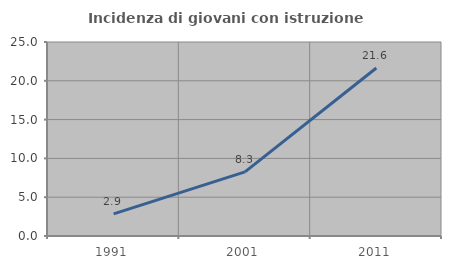
| Category | Incidenza di giovani con istruzione universitaria |
|---|---|
| 1991.0 | 2.857 |
| 2001.0 | 8.257 |
| 2011.0 | 21.649 |